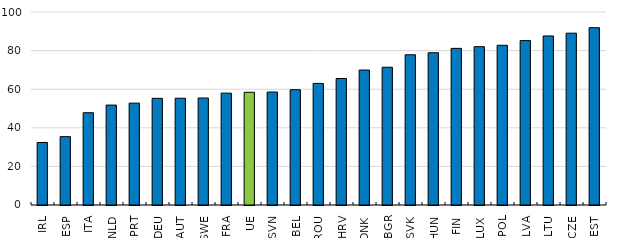
| Category | 2021 |
|---|---|
| IRL | 32.398 |
| ESP | 35.408 |
| ITA | 47.814 |
| NLD | 51.768 |
| PRT | 52.78 |
| DEU | 55.269 |
| AUT | 55.326 |
| SWE | 55.436 |
| FRA | 57.961 |
| UE | 58.418 |
| SVN | 58.521 |
| BEL | 59.733 |
| ROU | 62.996 |
| HRV | 65.54 |
| DNK | 69.927 |
| BGR | 71.376 |
| SVK | 77.831 |
| HUN | 78.895 |
| FIN | 81.16 |
| LUX | 82.03 |
| POL | 82.753 |
| LVA | 85.176 |
| LTU | 87.595 |
| CZE | 89.024 |
| EST | 91.871 |